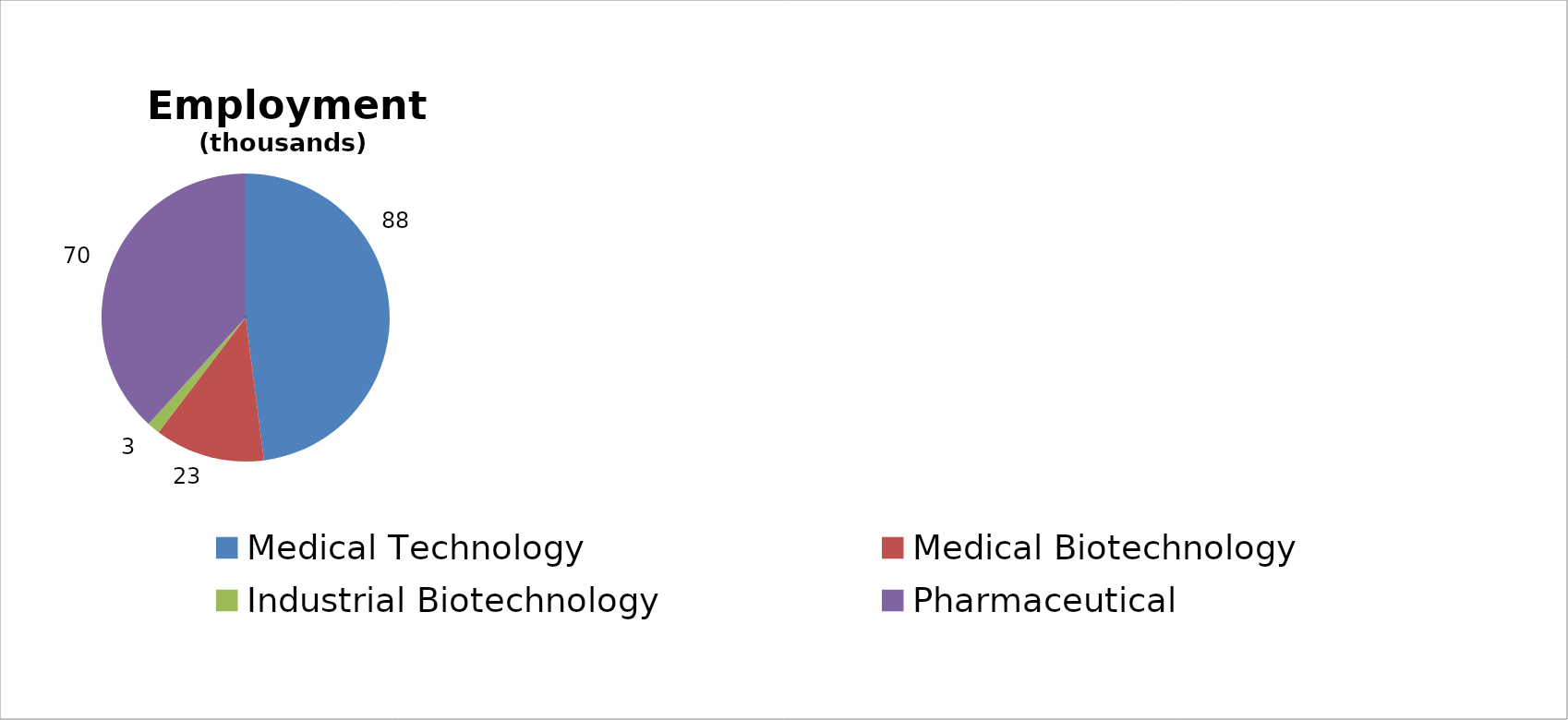
| Category | Series 0 |
|---|---|
| Medical Technology | 87.743 |
| Medical Biotechnology | 22.619 |
| Industrial Biotechnology | 2.64 |
| Pharmaceutical | 69.929 |